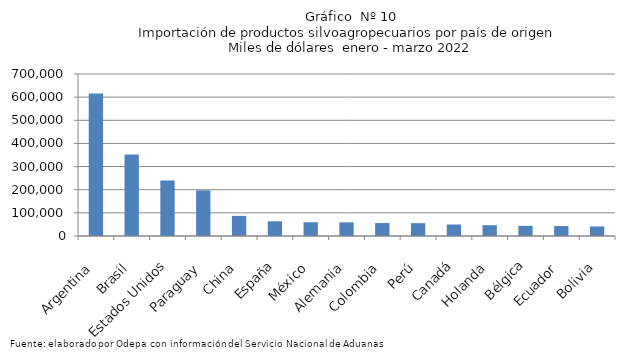
| Category | Series 0 |
|---|---|
| Argentina | 616274.046 |
| Brasil | 352495.702 |
| Estados Unidos | 240142.347 |
| Paraguay | 197140.029 |
| China | 87079.595 |
| España | 63410.15 |
| México | 59432.751 |
| Alemania | 58888.552 |
| Colombia | 56012.551 |
| Perú | 55407.008 |
| Canadá | 49662.518 |
| Holanda | 46778.606 |
| Bélgica | 43781.971 |
| Ecuador | 42907.079 |
| Bolivia | 41293.173 |